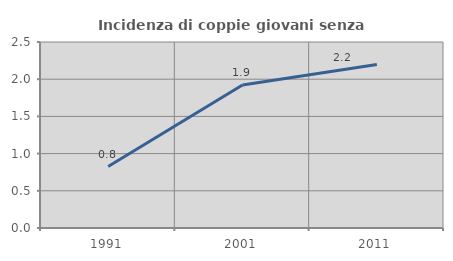
| Category | Incidenza di coppie giovani senza figli |
|---|---|
| 1991.0 | 0.826 |
| 2001.0 | 1.923 |
| 2011.0 | 2.198 |